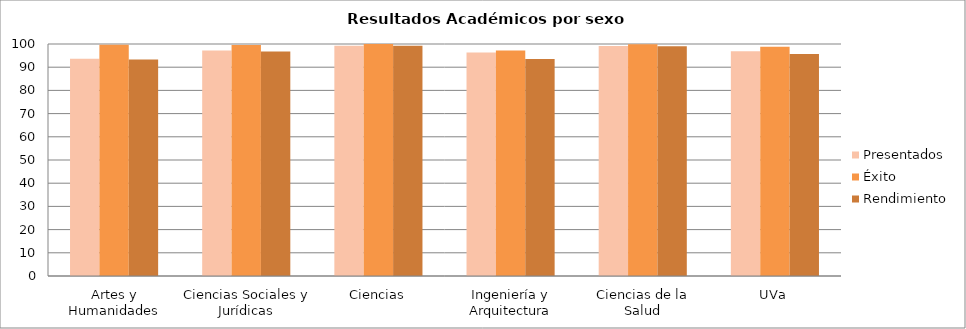
| Category | Presentados | Éxito | Rendimiento |
|---|---|---|---|
| Artes y Humanidades | 93.671 | 99.631 | 93.326 |
| Ciencias Sociales y Jurídicas | 97.2 | 99.537 | 96.75 |
| Ciencias | 99.237 | 100 | 99.237 |
| Ingeniería y Arquitectura | 96.295 | 97.16 | 93.56 |
| Ciencias de la Salud | 99.124 | 99.89 | 99.014 |
| UVa | 96.841 | 98.806 | 95.684 |